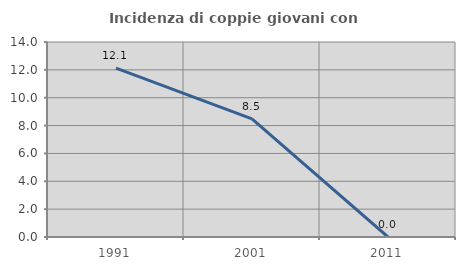
| Category | Incidenza di coppie giovani con figli |
|---|---|
| 1991.0 | 12.121 |
| 2001.0 | 8.475 |
| 2011.0 | 0 |